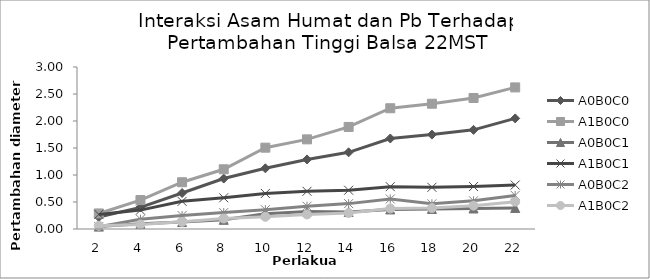
| Category | A0B0C0 | A1B0C0 | A0B0C1 | A1B0C1 | A0B0C2 | A1B0C2 |
|---|---|---|---|---|---|---|
| 2.0 | 0.222 | 0.288 | 0.044 | 0.27 | 0.044 | 0.06 |
| 4.0 | 0.4 | 0.536 | 0.096 | 0.35 | 0.182 | 0.084 |
| 6.0 | 0.666 | 0.866 | 0.128 | 0.512 | 0.25 | 0.132 |
| 8.0 | 0.934 | 1.106 | 0.17 | 0.578 | 0.304 | 0.194 |
| 10.0 | 1.124 | 1.506 | 0.282 | 0.658 | 0.358 | 0.226 |
| 12.0 | 1.288 | 1.66 | 0.326 | 0.698 | 0.422 | 0.27 |
| 14.0 | 1.42 | 1.89 | 0.316 | 0.718 | 0.47 | 0.296 |
| 16.0 | 1.676 | 2.236 | 0.362 | 0.784 | 0.556 | 0.38 |
| 18.0 | 1.748 | 2.32 | 0.372 | 0.772 | 0.466 | 0.388 |
| 20.0 | 1.836 | 2.426 | 0.38 | 0.786 | 0.522 | 0.432 |
| 22.0 | 2.048 | 2.622 | 0.39 | 0.814 | 0.622 | 0.506 |